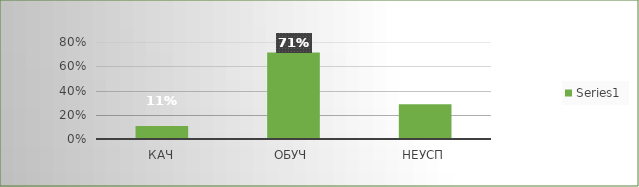
| Category | Series 0 |
|---|---|
| кач | 0.107 |
| обуч | 0.714 |
| неусп | 0.286 |